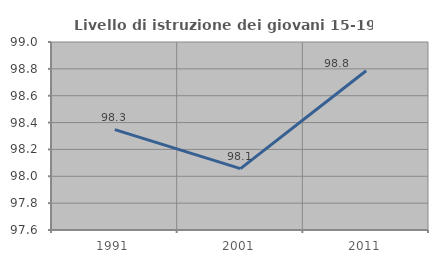
| Category | Livello di istruzione dei giovani 15-19 anni |
|---|---|
| 1991.0 | 98.348 |
| 2001.0 | 98.057 |
| 2011.0 | 98.786 |